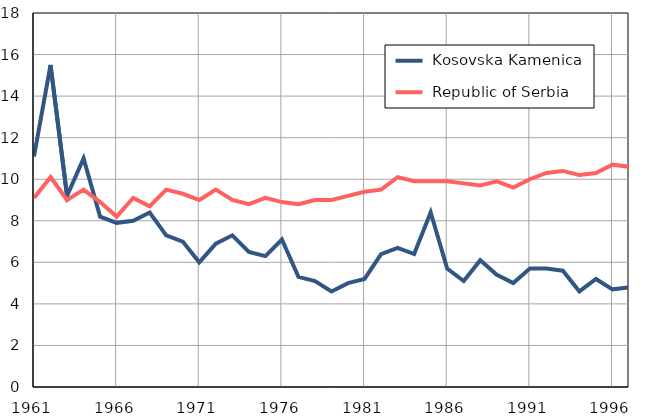
| Category |  Kosovska Kamenica |  Republic of Serbia |
|---|---|---|
| 1961.0 | 11.1 | 9.1 |
| 1962.0 | 15.5 | 10.1 |
| 1963.0 | 9.2 | 9 |
| 1964.0 | 11 | 9.5 |
| 1965.0 | 8.2 | 8.9 |
| 1966.0 | 7.9 | 8.2 |
| 1967.0 | 8 | 9.1 |
| 1968.0 | 8.4 | 8.7 |
| 1969.0 | 7.3 | 9.5 |
| 1970.0 | 7 | 9.3 |
| 1971.0 | 6 | 9 |
| 1972.0 | 6.9 | 9.5 |
| 1973.0 | 7.3 | 9 |
| 1974.0 | 6.5 | 8.8 |
| 1975.0 | 6.3 | 9.1 |
| 1976.0 | 7.1 | 8.9 |
| 1977.0 | 5.3 | 8.8 |
| 1978.0 | 5.1 | 9 |
| 1979.0 | 4.6 | 9 |
| 1980.0 | 5 | 9.2 |
| 1981.0 | 5.2 | 9.4 |
| 1982.0 | 6.4 | 9.5 |
| 1983.0 | 6.7 | 10.1 |
| 1984.0 | 6.4 | 9.9 |
| 1985.0 | 8.4 | 9.9 |
| 1986.0 | 5.7 | 9.9 |
| 1987.0 | 5.1 | 9.8 |
| 1988.0 | 6.1 | 9.7 |
| 1989.0 | 5.4 | 9.9 |
| 1990.0 | 5 | 9.6 |
| 1991.0 | 5.7 | 10 |
| 1992.0 | 5.7 | 10.3 |
| 1993.0 | 5.6 | 10.4 |
| 1994.0 | 4.6 | 10.2 |
| 1995.0 | 5.2 | 10.3 |
| 1996.0 | 4.7 | 10.7 |
| 1997.0 | 4.8 | 10.6 |